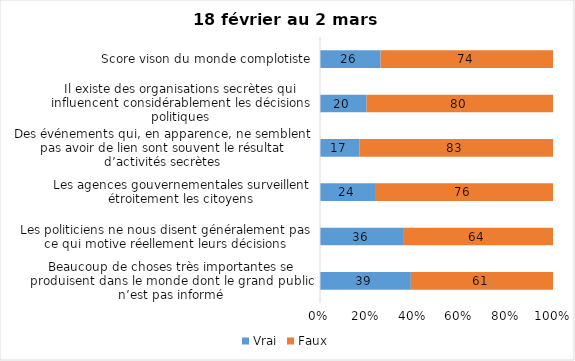
| Category | Vrai | Faux |
|---|---|---|
| Beaucoup de choses très importantes se produisent dans le monde dont le grand public n’est pas informé | 39 | 61 |
| Les politiciens ne nous disent généralement pas ce qui motive réellement leurs décisions | 36 | 64 |
| Les agences gouvernementales surveillent étroitement les citoyens | 24 | 76 |
| Des événements qui, en apparence, ne semblent pas avoir de lien sont souvent le résultat d’activités secrètes | 17 | 83 |
| Il existe des organisations secrètes qui influencent considérablement les décisions politiques | 20 | 80 |
| Score vison du monde complotiste | 26 | 74 |